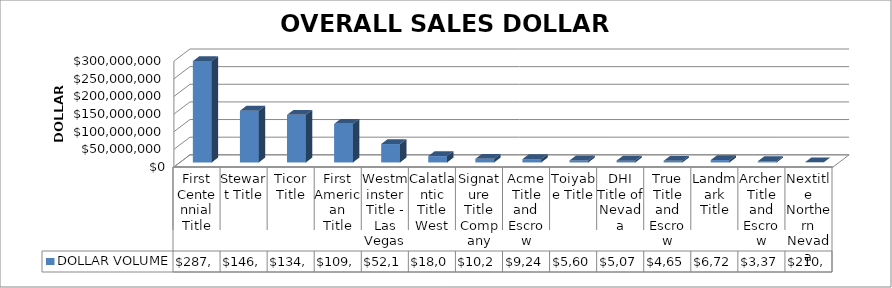
| Category | DOLLAR VOLUME |
|---|---|
| First Centennial Title | 287247330.66 |
| Stewart Title | 146567105 |
| Ticor Title | 134899114 |
| First American Title | 109350006.8 |
| Westminster Title - Las Vegas | 52163235 |
| Calatlantic Title West | 18016510 |
| Signature Title Company | 10245300 |
| Acme Title and Escrow | 9241000 |
| Toiyabe Title | 5608340 |
| DHI Title of Nevada | 5075925 |
| True Title and Escrow | 4656100 |
| Landmark Title | 6725000 |
| Archer Title and Escrow | 3375000 |
| Nextitle Northern Nevada | 210000 |